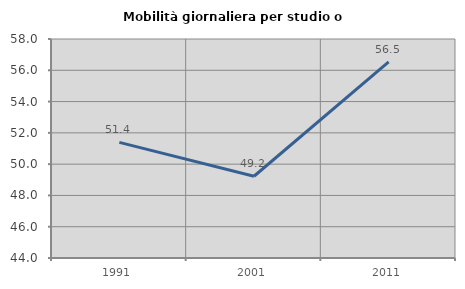
| Category | Mobilità giornaliera per studio o lavoro |
|---|---|
| 1991.0 | 51.39 |
| 2001.0 | 49.226 |
| 2011.0 | 56.539 |